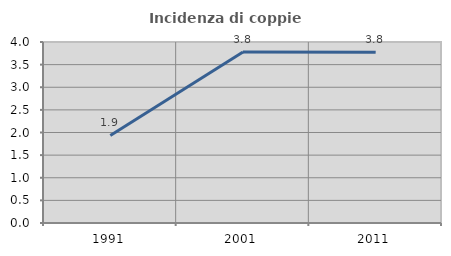
| Category | Incidenza di coppie miste |
|---|---|
| 1991.0 | 1.934 |
| 2001.0 | 3.778 |
| 2011.0 | 3.774 |